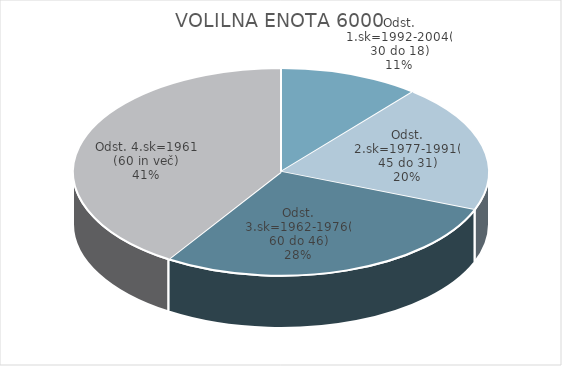
| Category | VOLILNA ENOTA 6000 |
|---|---|
| Odst. 1.sk=1992-2004(30 do 18) | 5.79 |
| Odst. 2.sk=1977-1991(45 do 31) | 10.56 |
| Odst. 3.sk=1962-1976(60 do 46) | 14.83 |
| Odst. 4.sk=1961 (60 in več) | 21.59 |